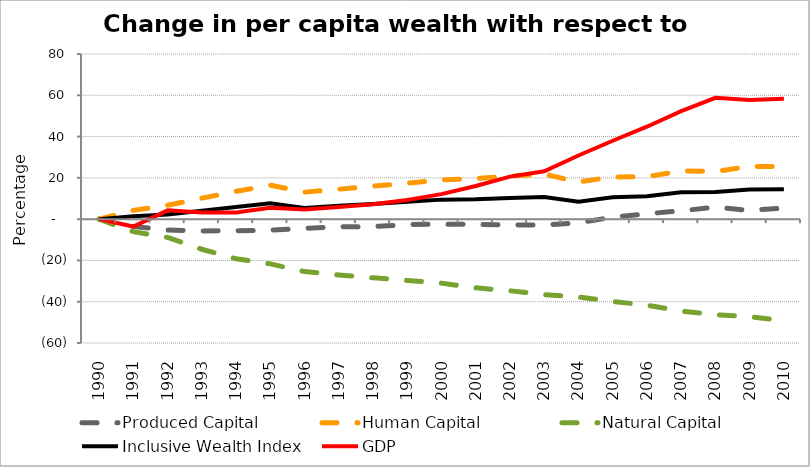
| Category | Produced Capital  | Human Capital | Natural Capital | Inclusive Wealth Index | GDP |
|---|---|---|---|---|---|
| 1990.0 | 0 | 0 | 0 | 0 | 0 |
| 1991.0 | -3.548 | 4.238 | -6.078 | 1.364 | -3.58 |
| 1992.0 | -5.306 | 6.693 | -8.85 | 2.291 | 4.273 |
| 1993.0 | -5.718 | 10.162 | -14.591 | 4.019 | 3.164 |
| 1994.0 | -5.628 | 13.463 | -19.21 | 5.856 | 3.242 |
| 1995.0 | -5.303 | 16.425 | -21.669 | 7.699 | 5.489 |
| 1996.0 | -4.44 | 13.066 | -25.395 | 5.445 | 4.629 |
| 1997.0 | -3.697 | 14.494 | -27.043 | 6.456 | 5.828 |
| 1998.0 | -3.6 | 15.981 | -28.389 | 7.355 | 7.263 |
| 1999.0 | -2.653 | 17.359 | -29.685 | 8.414 | 9.277 |
| 2000.0 | -2.41 | 18.999 | -31 | 9.454 | 12.132 |
| 2001.0 | -2.602 | 19.663 | -33.274 | 9.665 | 16.047 |
| 2002.0 | -2.822 | 20.801 | -34.694 | 10.245 | 20.59 |
| 2003.0 | -2.842 | 21.826 | -36.584 | 10.768 | 23.183 |
| 2004.0 | -1.77 | 18 | -37.678 | 8.464 | 30.821 |
| 2005.0 | 0.944 | 20.391 | -39.861 | 10.595 | 37.992 |
| 2006.0 | 2.601 | 20.6 | -41.694 | 11.038 | 44.773 |
| 2007.0 | 4.058 | 23.318 | -44.53 | 12.995 | 52.284 |
| 2008.0 | 5.775 | 23.076 | -46.313 | 13.162 | 58.789 |
| 2009.0 | 4.251 | 25.554 | -47.289 | 14.303 | 57.727 |
| 2010.0 | 5.32 | 25.556 | -49.192 | 14.447 | 58.359 |